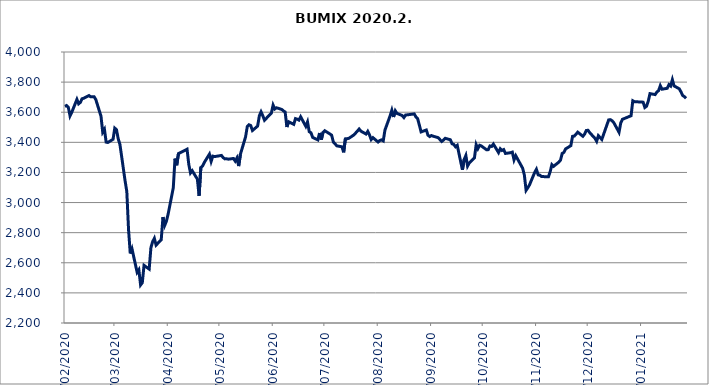
| Category | BUMIX |
|---|---|
| 03/02/2020 | 3638.694 |
| 04/02/2020 | 3644.537 |
| 05/02/2020 | 3633.445 |
| 06/02/2020 | 3575.411 |
| 07/02/2020 | 3599.09 |
| 10/02/2020 | 3685.329 |
| 11/02/2020 | 3655.704 |
| 12/02/2020 | 3665.2 |
| 13/02/2020 | 3689.429 |
| 14/02/2020 | 3692.855 |
| 17/02/2020 | 3710.688 |
| 18/02/2020 | 3702.429 |
| 19/02/2020 | 3702.769 |
| 20/02/2020 | 3702.999 |
| 21/02/2020 | 3683.652 |
| 24/02/2020 | 3573.462 |
| 25/02/2020 | 3467.389 |
| 26/02/2020 | 3486.394 |
| 27/02/2020 | 3401.245 |
| 28/02/2020 | 3399.235 |
| 02/03/2020 | 3420.246 |
| 03/03/2020 | 3494.226 |
| 04/03/2020 | 3483.577 |
| 05/03/2020 | 3423.588 |
| 06/03/2020 | 3385.851 |
| 09/03/2020 | 3144.177 |
| 10/03/2020 | 3072.652 |
| 11/03/2020 | 2820.535 |
| 12/03/2020 | 2662.105 |
| 13/03/2020 | 2692.893 |
| 16/03/2020 | 2536.434 |
| 17/03/2020 | 2553.266 |
| 18/03/2020 | 2452.38 |
| 19/03/2020 | 2467.745 |
| 20/03/2020 | 2582.933 |
| 23/03/2020 | 2557.974 |
| 24/03/2020 | 2699.957 |
| 25/03/2020 | 2740.292 |
| 26/03/2020 | 2762.106 |
| 27/03/2020 | 2717.193 |
| 30/03/2020 | 2753.32 |
| 31/03/2020 | 2903.405 |
| 01/04/2020 | 2848.003 |
| 02/04/2020 | 2876.351 |
| 03/04/2020 | 2922.776 |
| 06/04/2020 | 3098.155 |
| 07/04/2020 | 3291.703 |
| 08/04/2020 | 3247.741 |
| 09/04/2020 | 3325.054 |
| 14/04/2020 | 3354.249 |
| 15/04/2020 | 3254.495 |
| 16/04/2020 | 3196.492 |
| 17/04/2020 | 3211.51 |
| 20/04/2020 | 3155.294 |
| 21/04/2020 | 3044.985 |
| 22/04/2020 | 3232.536 |
| 23/04/2020 | 3242.489 |
| 24/04/2020 | 3266.09 |
| 27/04/2020 | 3321.588 |
| 28/04/2020 | 3273.7 |
| 29/04/2020 | 3308.202 |
| 30/04/2020 | 3305.2 |
| 04/05/2020 | 3312.857 |
| 05/05/2020 | 3298.356 |
| 06/05/2020 | 3290.116 |
| 07/05/2020 | 3290.63 |
| 08/05/2020 | 3288.226 |
| 11/05/2020 | 3292.683 |
| 12/05/2020 | 3275.228 |
| 13/05/2020 | 3296.53 |
| 14/05/2020 | 3242.319 |
| 15/05/2020 | 3320.851 |
| 18/05/2020 | 3436.227 |
| 19/05/2020 | 3504.886 |
| 20/05/2020 | 3516.58 |
| 21/05/2020 | 3511.622 |
| 22/05/2020 | 3478.592 |
| 25/05/2020 | 3507.883 |
| 26/05/2020 | 3576.134 |
| 27/05/2020 | 3602.548 |
| 28/05/2020 | 3576.97 |
| 29/05/2020 | 3546.922 |
| 02/06/2020 | 3594.239 |
| 03/06/2020 | 3647.393 |
| 04/06/2020 | 3621.769 |
| 05/06/2020 | 3629.497 |
| 08/06/2020 | 3618.717 |
| 09/06/2020 | 3608.736 |
| 10/06/2020 | 3601.796 |
| 11/06/2020 | 3501.797 |
| 12/06/2020 | 3536.763 |
| 15/06/2020 | 3519.634 |
| 16/06/2020 | 3557.404 |
| 17/06/2020 | 3553.83 |
| 18/06/2020 | 3547.652 |
| 19/06/2020 | 3569.854 |
| 22/06/2020 | 3506.192 |
| 23/06/2020 | 3535.486 |
| 24/06/2020 | 3470.553 |
| 25/06/2020 | 3463.496 |
| 26/06/2020 | 3432.731 |
| 29/06/2020 | 3416.07 |
| 30/06/2020 | 3461.98 |
| 01/07/2020 | 3416.81 |
| 02/07/2020 | 3466.2 |
| 03/07/2020 | 3477.25 |
| 06/07/2020 | 3455.57 |
| 07/07/2020 | 3447.7 |
| 08/07/2020 | 3402.34 |
| 09/07/2020 | 3390.36 |
| 10/07/2020 | 3376.63 |
| 13/07/2020 | 3370.43 |
| 14/07/2020 | 3333.48 |
| 15/07/2020 | 3423.08 |
| 16/07/2020 | 3424.08 |
| 17/07/2020 | 3426.43 |
| 20/07/2020 | 3449.86 |
| 21/07/2020 | 3462.4 |
| 22/07/2020 | 3475.18 |
| 23/07/2020 | 3488.48 |
| 24/07/2020 | 3474.49 |
| 27/07/2020 | 3455.12 |
| 28/07/2020 | 3472.66 |
| 29/07/2020 | 3449.53 |
| 30/07/2020 | 3418.31 |
| 31/07/2020 | 3431.21 |
| 03/08/2020 | 3401.97 |
| 04/08/2020 | 3411.95 |
| 05/08/2020 | 3416.29 |
| 06/08/2020 | 3409.59 |
| 07/08/2020 | 3481.72 |
| 10/08/2020 | 3576.54 |
| 11/08/2020 | 3613.16 |
| 12/08/2020 | 3568.41 |
| 13/08/2020 | 3609.29 |
| 14/08/2020 | 3592 |
| 17/08/2020 | 3578.22 |
| 18/08/2020 | 3564.56 |
| 19/08/2020 | 3581.3 |
| 24/08/2020 | 3588.71 |
| 25/08/2020 | 3568.88 |
| 26/08/2020 | 3556.56 |
| 27/08/2020 | 3513.57 |
| 28/08/2020 | 3469.22 |
| 31/08/2020 | 3481.8 |
| 01/09/2020 | 3447.2 |
| 02/09/2020 | 3438.46 |
| 03/09/2020 | 3445.17 |
| 04/09/2020 | 3440.86 |
| 07/09/2020 | 3430.65 |
| 08/09/2020 | 3417.52 |
| 09/09/2020 | 3406.05 |
| 10/09/2020 | 3415.25 |
| 11/09/2020 | 3426.71 |
| 14/09/2020 | 3417.2 |
| 15/09/2020 | 3390.17 |
| 16/09/2020 | 3386.09 |
| 17/09/2020 | 3370.49 |
| 18/09/2020 | 3380.1 |
| 21/09/2020 | 3217.33 |
| 22/09/2020 | 3285.6 |
| 23/09/2020 | 3312.51 |
| 24/09/2020 | 3242.4 |
| 25/09/2020 | 3263.45 |
| 28/09/2020 | 3297.41 |
| 29/09/2020 | 3384.4 |
| 30/09/2020 | 3357.82 |
| 01/10/2020 | 3380.37 |
| 02/10/2020 | 3375.87 |
| 05/10/2020 | 3350.89 |
| 06/10/2020 | 3351.47 |
| 07/10/2020 | 3375.67 |
| 08/10/2020 | 3372.9 |
| 09/10/2020 | 3388.36 |
| 12/10/2020 | 3331.7 |
| 13/10/2020 | 3357.1 |
| 14/10/2020 | 3345.75 |
| 15/10/2020 | 3351.72 |
| 16/10/2020 | 3326.29 |
| 19/10/2020 | 3331.12 |
| 20/10/2020 | 3334.91 |
| 21/10/2020 | 3283.17 |
| 22/10/2020 | 3311.3 |
| 26/10/2020 | 3228.15 |
| 27/10/2020 | 3182.22 |
| 28/10/2020 | 3081.52 |
| 29/10/2020 | 3098.86 |
| 30/10/2020 | 3117.81 |
| 02/11/2020 | 3200.25 |
| 03/11/2020 | 3220.92 |
| 04/11/2020 | 3183.95 |
| 05/11/2020 | 3181.86 |
| 06/11/2020 | 3172.91 |
| 09/11/2020 | 3171.47 |
| 10/11/2020 | 3171.23 |
| 11/11/2020 | 3204.99 |
| 12/11/2020 | 3252 |
| 13/11/2020 | 3240.74 |
| 16/11/2020 | 3268.32 |
| 17/11/2020 | 3282.14 |
| 18/11/2020 | 3326.62 |
| 19/11/2020 | 3333.37 |
| 20/11/2020 | 3356.65 |
| 23/11/2020 | 3377.82 |
| 24/11/2020 | 3439.84 |
| 25/11/2020 | 3441.29 |
| 26/11/2020 | 3453.36 |
| 27/11/2020 | 3467.59 |
| 30/11/2020 | 3440.21 |
| 01/12/2020 | 3454.61 |
| 02/12/2020 | 3479.14 |
| 03/12/2020 | 3479.7 |
| 04/12/2020 | 3463.96 |
| 07/12/2020 | 3426.71 |
| 08/12/2020 | 3406.79 |
| 09/12/2020 | 3444.12 |
| 10/12/2020 | 3431.99 |
| 11/12/2020 | 3418.86 |
| 14/12/2020 | 3517.03 |
| 15/12/2020 | 3549.02 |
| 16/12/2020 | 3550.69 |
| 17/12/2020 | 3543.31 |
| 18/12/2020 | 3530.03 |
| 21/12/2020 | 3466.56 |
| 22/12/2020 | 3528.93 |
| 23/12/2020 | 3553 |
| 28/12/2020 | 3576.63 |
| 29/12/2020 | 3676.15 |
| 30/12/2020 | 3670.042 |
| 04/01/2021 | 3666.94 |
| 05/01/2021 | 3631.47 |
| 06/01/2021 | 3639.83 |
| 07/01/2021 | 3673.66 |
| 08/01/2021 | 3723.52 |
| 11/01/2021 | 3717.11 |
| 12/01/2021 | 3733.93 |
| 13/01/2021 | 3743.66 |
| 14/01/2021 | 3776.42 |
| 15/01/2021 | 3753.13 |
| 18/01/2021 | 3758.69 |
| 19/01/2021 | 3783.21 |
| 20/01/2021 | 3774.08 |
| 21/01/2021 | 3816.27 |
| 22/01/2021 | 3774.64 |
| 25/01/2021 | 3755.75 |
| 26/01/2021 | 3735.14 |
| 27/01/2021 | 3711.23 |
| 28/01/2021 | 3703.47 |
| 29/01/2021 | 3692.35 |